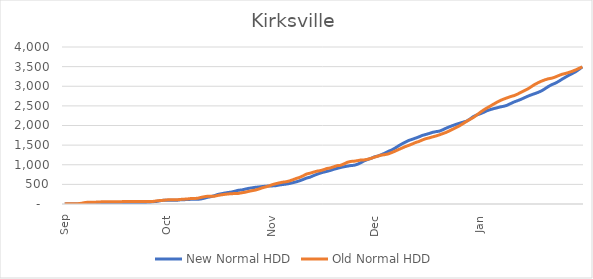
| Category | New Normal HDD | Old Normal HDD |
|---|---|---|
|  Sep  | 0 | 1.311 |
|  | 0 | 8.519 |
|  | 0 | 8.519 |
|  | 0 | 8.519 |
|  | 0 | 8.519 |
|  | 0 | 19.829 |
|  | 0.402 | 37.28 |
|  | 3.334 | 47.059 |
|  | 9.503 | 47.059 |
|  | 14.768 | 47.059 |
|  | 16.922 | 50.918 |
|  | 16.922 | 56.183 |
|  | 16.922 | 56.585 |
|  | 16.922 | 56.585 |
|  | 16.922 | 56.585 |
|  | 16.922 | 56.585 |
|  | 16.922 | 56.585 |
|  | 16.922 | 61.117 |
|  | 16.922 | 64.049 |
|  | 16.922 | 64.049 |
|  | 16.922 | 64.049 |
|  | 26.701 | 64.049 |
|  | 35.099 | 64.049 |
|  | 39.631 | 64.049 |
|  | 40.942 | 64.049 |
|  | 44.801 | 64.049 |
|  | 58.237 | 66.203 |
|  | 65.445 | 79.639 |
|  | 82.896 | 88.037 |
|  | 94.206 | 94.206 |
|  Oct  | 95.976 | 104.766 |
|  | 95.976 | 107.745 |
|  | 95.976 | 107.745 |
|  | 96.607 | 107.745 |
|  | 106.294 | 116.648 |
|  | 109.273 | 122.684 |
|  | 114.328 | 127.738 |
|  | 118.27 | 139.045 |
|  | 118.27 | 139.045 |
|  | 118.27 | 146.27 |
|  | 128.83 | 166.893 |
|  | 147.492 | 185.556 |
|  | 171.944 | 198.543 |
|  | 187.766 | 198.543 |
|  | 213.869 | 199.173 |
|  | 244.436 | 218.803 |
|  | 262.018 | 233.664 |
|  | 278.701 | 245.756 |
|  | 292.585 | 255.443 |
|  | 304.677 | 263.553 |
|  | 326.583 | 265.324 |
|  | 349.733 | 269.266 |
|  | 357.843 | 285.948 |
|  | 378.466 | 299.832 |
|  | 398.096 | 321.738 |
|  | 411.084 | 339.321 |
|  | 425.945 | 355.143 |
|  | 433.169 | 381.246 |
|  | 444.476 | 411.813 |
|  | 453.379 | 434.963 |
|  | 459.415 | 459.415 |
|  Nov  | 461.205 | 494.11 |
|  | 466.591 | 516.87 |
|  | 483.726 | 537.464 |
|  | 496.259 | 555.542 |
|  | 506.726 | 566.01 |
|  | 521.803 | 587.282 |
|  | 542.397 | 617.194 |
|  | 564.461 | 650.438 |
|  | 592.181 | 678.158 |
|  | 624.165 | 716.626 |
|  | 660.476 | 763.778 |
|  | 681.749 | 783.354 |
|  | 720.217 | 809.906 |
|  | 754.913 | 835.326 |
|  | 785.874 | 849.239 |
|  | 811.294 | 872.849 |
|  | 830.871 | 904.833 |
|  | 855.334 | 917.366 |
|  | 884.264 | 948.326 |
|  | 907.023 | 977.256 |
|  | 930.633 | 985.163 |
|  | 948.711 | 1021.474 |
|  | 964.774 | 1062.581 |
|  | 978.687 | 1084.646 |
|  | 986.594 | 1090.032 |
|  | 1013.145 | 1105.109 |
|  | 1054.253 | 1122.243 |
|  | 1101.404 | 1124.034 |
|  | 1134.649 | 1140.097 |
|  | 1164.56 | 1164.56 |
|  Dec  | 1201.931 | 1194.016 |
|  | 1222.646 | 1220.583 |
|  | 1256.328 | 1245.114 |
|  | 1295.671 | 1257.294 |
|  | 1339.587 | 1275.519 |
|  | 1375.403 | 1309.201 |
|  | 1423.023 | 1345.016 |
|  | 1479.437 | 1386.089 |
|  | 1529.543 | 1422.615 |
|  | 1575.223 | 1461.958 |
|  | 1617.572 | 1492.134 |
|  | 1647.028 | 1526.861 |
|  | 1677.204 | 1565.141 |
|  | 1709.138 | 1592.758 |
|  | 1747.418 | 1630.128 |
|  | 1770.448 | 1662.953 |
|  | 1796.082 | 1683.668 |
|  | 1824.716 | 1709.302 |
|  | 1842.941 | 1732.331 |
|  | 1855.121 | 1760.965 |
|  | 1889.848 | 1792.899 |
|  | 1930.92 | 1823.866 |
|  | 1967.447 | 1864.041 |
|  | 2000.271 | 1906.39 |
|  | 2031.238 | 1950.307 |
|  | 2058.854 | 1995.987 |
|  | 2085.421 | 2049.042 |
|  | 2109.952 | 2105.456 |
|  | 2163.008 | 2155.562 |
|  | 2227.149 | 2203.182 |
|  | 2267.324 | 2267.324 |
|  Jan  | 2298.092 | 2333.146 |